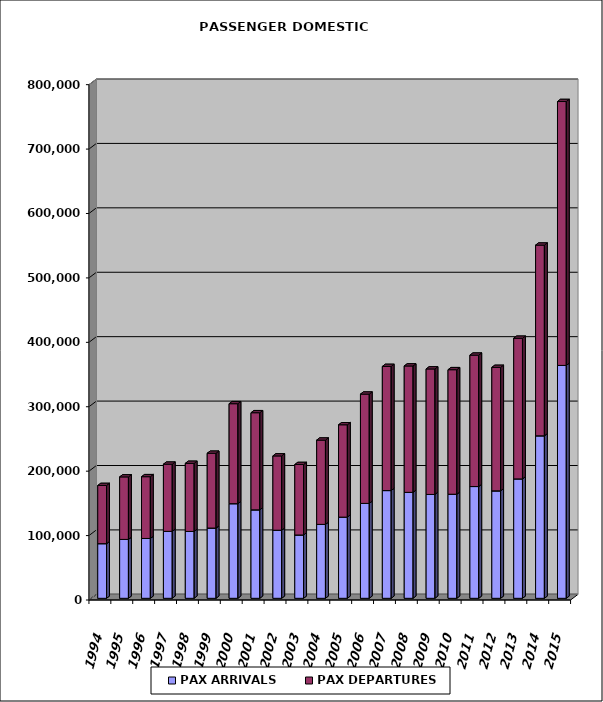
| Category | PAX ARRIVALS | PAX DEPARTURES |
|---|---|---|
| 1994.0 | 84825 | 90327 |
| 1995.0 | 91425 | 97036 |
| 1996.0 | 92893 | 95885 |
| 1997.0 | 103896 | 104299 |
| 1998.0 | 103817 | 105688 |
| 1999.0 | 109042 | 116118 |
| 2000.0 | 146885 | 155187 |
| 2001.0 | 137314 | 150770 |
| 2002.0 | 105704 | 115336 |
| 2003.0 | 98301 | 109394 |
| 2004.0 | 114742 | 130835 |
| 2005.0 | 126006 | 143365 |
| 2006.0 | 147322 | 169651 |
| 2007.0 | 167242 | 192708 |
| 2008.0 | 164483 | 196187 |
| 2009.0 | 161220 | 194820 |
| 2010.0 | 161553 | 193319 |
| 2011.0 | 173496 | 203977 |
| 2012.0 | 166786 | 191682 |
| 2013.0 | 185378 | 218309 |
| 2014.0 | 252223 | 296051 |
| 2015.0 | 361525 | 409668 |